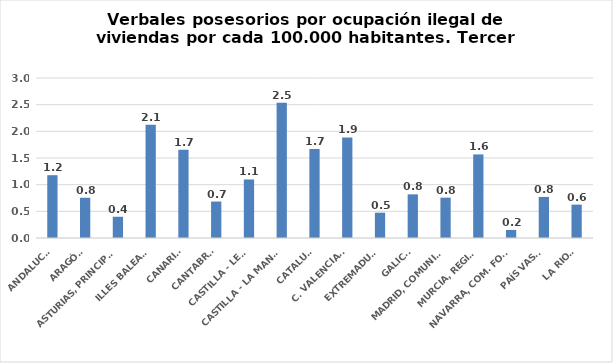
| Category | Series 0 |
|---|---|
| ANDALUCÍA | 1.178 |
| ARAGÓN | 0.755 |
| ASTURIAS, PRINCIPADO | 0.398 |
| ILLES BALEARS | 2.125 |
| CANARIAS | 1.654 |
| CANTABRIA | 0.684 |
| CASTILLA - LEÓN | 1.097 |
| CASTILLA - LA MANCHA | 2.534 |
| CATALUÑA | 1.67 |
| C. VALENCIANA | 1.886 |
| EXTREMADURA | 0.474 |
| GALICIA | 0.818 |
| MADRID, COMUNIDAD | 0.756 |
| MURCIA, REGIÓN | 1.567 |
| NAVARRA, COM. FORAL | 0.151 |
| PAÍS VASCO | 0.77 |
| LA RIOJA | 0.626 |